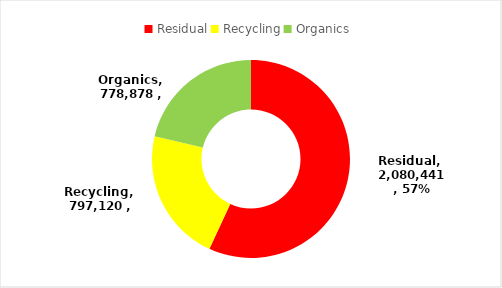
| Category | Series 0 |
|---|---|
| Residual | 2080441.08 |
| Recycling | 797119.608 |
| Organics | 778877.75 |